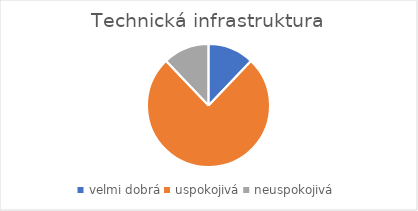
| Category | Technická infrastruktura |
|---|---|
| velmi dobrá | 31 |
| uspokojivá | 194 |
| neuspokojivá | 31 |